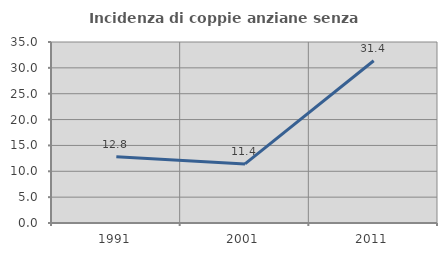
| Category | Incidenza di coppie anziane senza figli  |
|---|---|
| 1991.0 | 12.821 |
| 2001.0 | 11.429 |
| 2011.0 | 31.373 |